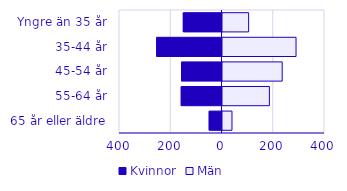
| Category | Kvinnor | Män |
|---|---|---|
| 0 | -151 | 102 |
| 1 | -255 | 287 |
| 2 | -158 | 233 |
| 3 | -159 | 183 |
| 4 | -50 | 37 |